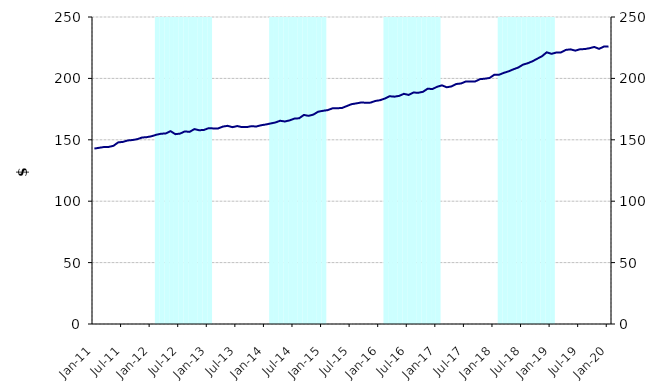
| Category | Series 1 |
|---|---|
| 0 | 0 |
| 1900-01-01 | 0 |
| 1900-01-02 | 0 |
| 1900-01-03 | 0 |
| 1900-01-04 | 0 |
| 1900-01-05 | 0 |
| 1900-01-06 | 0 |
| 1900-01-07 | 0 |
| 1900-01-08 | 0 |
| 1900-01-09 | 0 |
| 1900-01-10 | 0 |
| 1900-01-11 | 0 |
| 1900-01-12 | 0 |
| 1900-01-13 | 250000000 |
| 1900-01-14 | 250000000 |
| 1900-01-15 | 250000000 |
| 1900-01-16 | 250000000 |
| 1900-01-17 | 250000000 |
| 1900-01-18 | 250000000 |
| 1900-01-19 | 250000000 |
| 1900-01-20 | 250000000 |
| 1900-01-21 | 250000000 |
| 1900-01-22 | 250000000 |
| 1900-01-23 | 250000000 |
| 1900-01-24 | 250000000 |
| 1900-01-25 | 0 |
| 1900-01-26 | 0 |
| 1900-01-27 | 0 |
| 1900-01-28 | 0 |
| 1900-01-29 | 0 |
| 1900-01-30 | 0 |
| 1900-01-31 | 0 |
| 1900-02-01 | 0 |
| 1900-02-02 | 0 |
| 1900-02-03 | 0 |
| 1900-02-04 | 0 |
| 1900-02-05 | 0 |
| 1900-02-06 | 250000000 |
| 1900-02-07 | 250000000 |
| 1900-02-08 | 250000000 |
| 1900-02-09 | 250000000 |
| 1900-02-10 | 250000000 |
| 1900-02-11 | 250000000 |
| 1900-02-12 | 250000000 |
| 1900-02-13 | 250000000 |
| 1900-02-14 | 250000000 |
| 1900-02-15 | 250000000 |
| 1900-02-16 | 250000000 |
| 1900-02-17 | 250000000 |
| 1900-02-18 | 0 |
| 1900-02-19 | 0 |
| 1900-02-20 | 0 |
| 1900-02-21 | 0 |
| 1900-02-22 | 0 |
| 1900-02-23 | 0 |
| 1900-02-24 | 0 |
| 1900-02-25 | 0 |
| 1900-02-26 | 0 |
| 1900-02-27 | 0 |
| 1900-02-28 | 0 |
| 1900-02-28 | 0 |
| 1900-03-01 | 250000000 |
| 1900-03-02 | 250000000 |
| 1900-03-03 | 250000000 |
| 1900-03-04 | 250000000 |
| 1900-03-05 | 250000000 |
| 1900-03-06 | 250000000 |
| 1900-03-07 | 250000000 |
| 1900-03-08 | 250000000 |
| 1900-03-09 | 250000000 |
| 1900-03-10 | 250000000 |
| 1900-03-11 | 250000000 |
| 1900-03-12 | 250000000 |
| 1900-03-13 | 0 |
| 1900-03-14 | 0 |
| 1900-03-15 | 0 |
| 1900-03-16 | 0 |
| 1900-03-17 | 0 |
| 1900-03-18 | 0 |
| 1900-03-19 | 0 |
| 1900-03-20 | 0 |
| 1900-03-21 | 0 |
| 1900-03-22 | 0 |
| 1900-03-23 | 0 |
| 1900-03-24 | 0 |
| 1900-03-25 | 250000000 |
| 1900-03-26 | 250000000 |
| 1900-03-27 | 250000000 |
| 1900-03-28 | 250000000 |
| 1900-03-29 | 250000000 |
| 1900-03-30 | 250000000 |
| 1900-03-31 | 250000000 |
| 1900-04-01 | 250000000 |
| 1900-04-02 | 250000000 |
| 1900-04-03 | 250000000 |
| 1900-04-04 | 250000000 |
| 1900-04-05 | 250000000 |
| 1900-04-06 | 0 |
| 1900-04-07 | 0 |
| 1900-04-08 | 0 |
| 1900-04-09 | 0 |
| 1900-04-10 | 0 |
| 1900-04-11 | 0 |
| 1900-04-12 | 0 |
| 1900-04-13 | 0 |
| 1900-04-14 | 0 |
| 1900-04-15 | 0 |
| 1900-04-16 | 0 |
| 1900-04-17 | 0 |